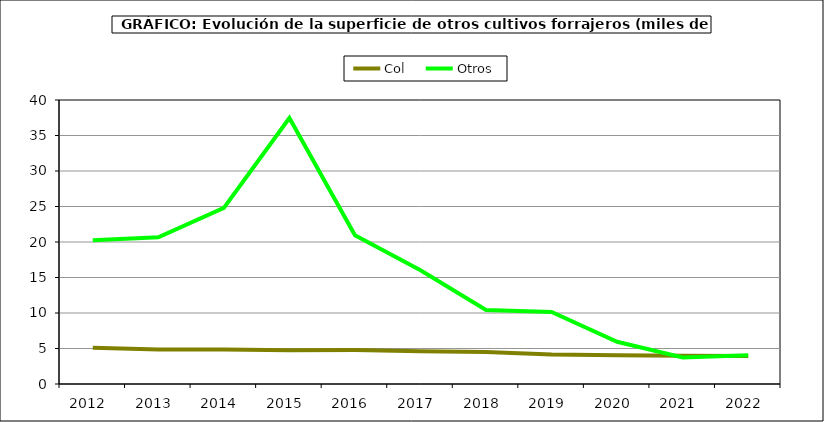
| Category | Col | Otros |
|---|---|---|
| 2012.0 | 5.09 | 20.245 |
| 2013.0 | 4.865 | 20.659 |
| 2014.0 | 4.875 | 24.797 |
| 2015.0 | 4.771 | 37.464 |
| 2016.0 | 4.781 | 20.965 |
| 2017.0 | 4.601 | 16.007 |
| 2018.0 | 4.492 | 10.42 |
| 2019.0 | 4.151 | 10.158 |
| 2020.0 | 4.059 | 5.942 |
| 2021.0 | 3.969 | 3.731 |
| 2022.0 | 3.937 | 4.045 |